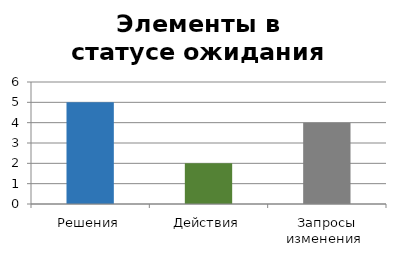
| Category | Series 0 |
|---|---|
| Решения | 5 |
| Действия | 2 |
| Запросы изменения  | 4 |